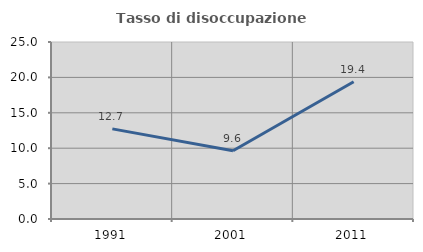
| Category | Tasso di disoccupazione giovanile  |
|---|---|
| 1991.0 | 12.727 |
| 2001.0 | 9.645 |
| 2011.0 | 19.38 |